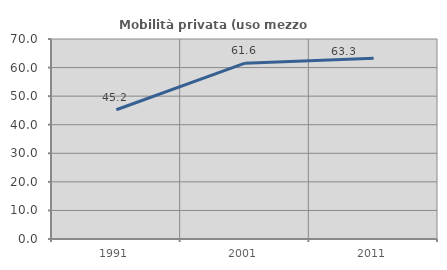
| Category | Mobilità privata (uso mezzo privato) |
|---|---|
| 1991.0 | 45.247 |
| 2001.0 | 61.551 |
| 2011.0 | 63.268 |